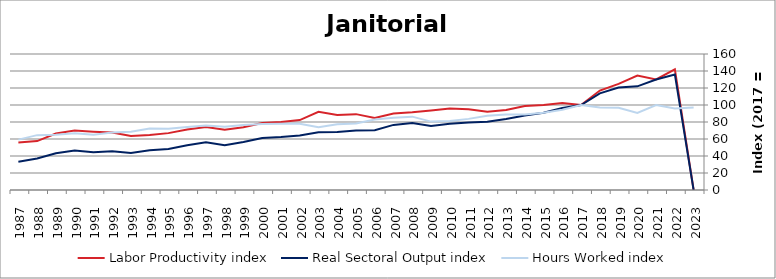
| Category | Labor Productivity index | Real Sectoral Output index | Hours Worked index |
|---|---|---|---|
| 2023.0 | 0 | 0 | 97.165 |
| 2022.0 | 141.999 | 135.973 | 95.757 |
| 2021.0 | 130.071 | 129.91 | 99.876 |
| 2020.0 | 134.667 | 121.958 | 90.562 |
| 2019.0 | 124.778 | 120.575 | 96.632 |
| 2018.0 | 117.017 | 113.702 | 97.168 |
| 2017.0 | 100 | 100 | 100 |
| 2016.0 | 102.248 | 96.438 | 94.318 |
| 2015.0 | 99.973 | 90.822 | 90.847 |
| 2014.0 | 98.864 | 87.751 | 88.759 |
| 2013.0 | 94.141 | 83.527 | 88.726 |
| 2012.0 | 91.963 | 80.367 | 87.391 |
| 2011.0 | 94.997 | 79.48 | 83.666 |
| 2010.0 | 95.873 | 77.813 | 81.162 |
| 2009.0 | 93.457 | 75.202 | 80.467 |
| 2008.0 | 91.4 | 78.878 | 86.3 |
| 2007.0 | 89.984 | 76.6 | 85.126 |
| 2006.0 | 84.717 | 70.321 | 83.007 |
| 2005.0 | 89.244 | 69.943 | 78.373 |
| 2004.0 | 88.306 | 68.302 | 77.347 |
| 2003.0 | 92.086 | 67.912 | 73.749 |
| 2002.0 | 82.299 | 64.178 | 77.981 |
| 2001.0 | 79.926 | 62.231 | 77.861 |
| 2000.0 | 78.721 | 61.14 | 77.666 |
| 1999.0 | 73.734 | 56.4 | 76.491 |
| 1998.0 | 70.798 | 52.634 | 74.343 |
| 1997.0 | 74.065 | 56.121 | 75.772 |
| 1996.0 | 71.284 | 52.748 | 73.997 |
| 1995.0 | 66.912 | 48.282 | 72.158 |
| 1994.0 | 64.73 | 46.875 | 72.416 |
| 1993.0 | 63.51 | 43.528 | 68.537 |
| 1992.0 | 67.657 | 45.703 | 67.551 |
| 1991.0 | 68.572 | 44.549 | 64.968 |
| 1990.0 | 69.876 | 46.548 | 66.615 |
| 1989.0 | 66.426 | 43.256 | 65.119 |
| 1988.0 | 57.549 | 37.148 | 64.55 |
| 1987.0 | 56.007 | 33.209 | 59.295 |